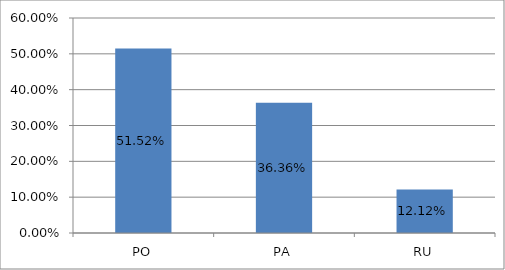
| Category | Series 0 |
|---|---|
| PO | 0.515 |
| PA | 0.364 |
| RU | 0.121 |